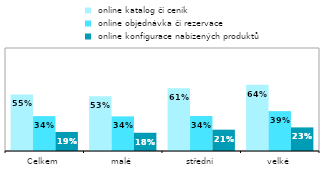
| Category |  online katalog či ceník |  online objednávka či rezervace |  online konfigurace nabízených produktů |
|---|---|---|---|
| Celkem | 0.549 | 0.339 | 0.185 |
| malé | 0.531 | 0.336 | 0.177 |
| střední | 0.61 | 0.34 | 0.207 |
| velké | 0.642 | 0.387 | 0.229 |